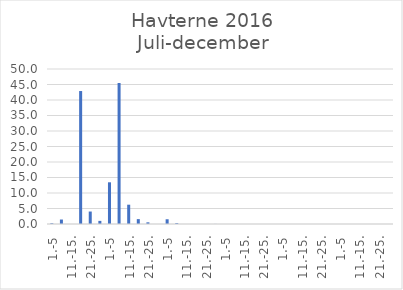
| Category | Series 0 |
|---|---|
| 1.-5 | 0.24 |
| 6.-10. | 1.445 |
| 11.-15. | 0 |
| 16.-20. | 42.892 |
| 21.-25. | 4.022 |
| 26.-31. | 1.005 |
| 1.-5 | 13.453 |
| 6.-10. | 45.479 |
| 11.-15. | 6.228 |
| 16.-20. | 1.575 |
| 21.-25. | 0.539 |
| 26.-31. | 0 |
| 1.-5 | 1.53 |
| 6.-10. | 0.279 |
| 11.-15. | 0 |
| 16.-20. | 0 |
| 21.-25. | 0 |
| 26.-30. | 0.022 |
| 1.-5 | 0 |
| 6.-10. | 0 |
| 11.-15. | 0 |
| 16.-20. | 0 |
| 21.-25. | 0 |
| 26.-31. | 0 |
| 1.-5 | 0 |
| 6.-10. | 0 |
| 11.-15. | 0 |
| 16.-20. | 0 |
| 21.-25. | 0 |
| 26.-30. | 0 |
| 1.-5 | 0 |
| 6.-10. | 0 |
| 11.-15. | 0 |
| 16.-20. | 0 |
| 21.-25. | 0 |
| 26.-31. | 0 |